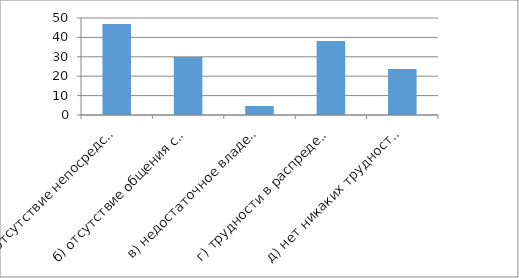
| Category | Series 0 |
|---|---|
| а) отсутствие непосредственного общения с учителем;  | 46.907 |
| б) отсутствие общения с одноклассниками;  | 29.897 |
| в) недостаточное владение компьютерными технологиями; | 4.639 |
| г) трудности в распределении времени (на учебу, на отдых); | 38.144 |
| д) нет никаких трудностей.  | 23.711 |